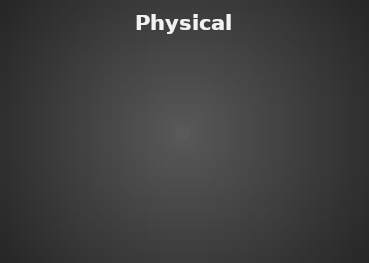
| Category | Physical Science |
|---|---|
| % of Students passed | 0 |
| % of Students need improvement | 0 |